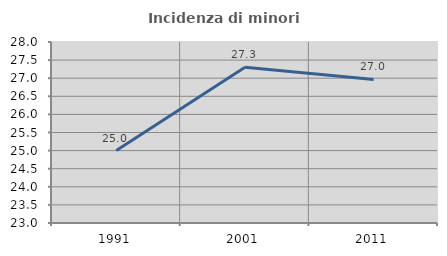
| Category | Incidenza di minori stranieri |
|---|---|
| 1991.0 | 25 |
| 2001.0 | 27.305 |
| 2011.0 | 26.966 |